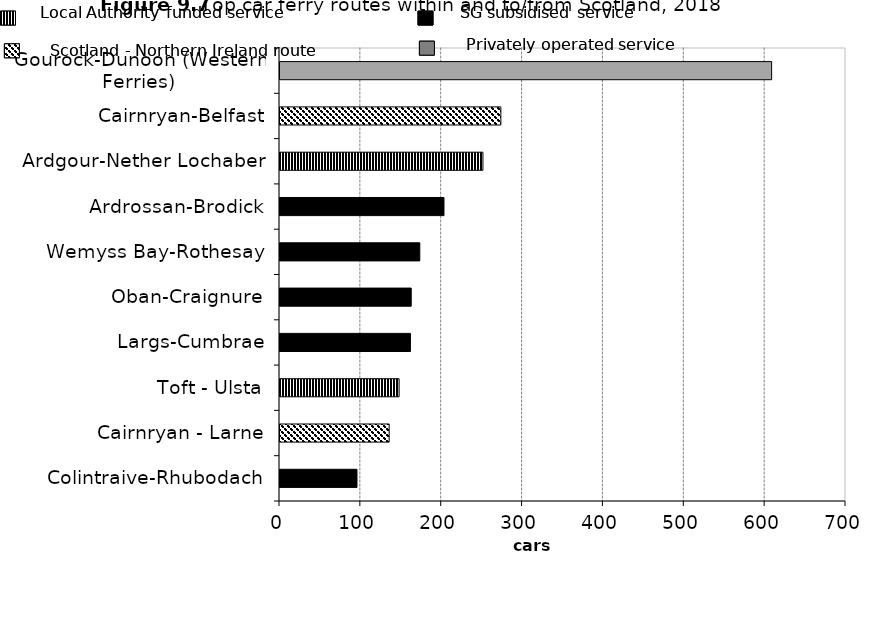
| Category | Cars |
|---|---|
| Colintraive-Rhubodach | 95.2 |
| Cairnryan - Larne | 135.01 |
| Toft - Ulsta | 147.28 |
| Largs-Cumbrae | 161.3 |
| Oban-Craignure | 162.3 |
| Wemyss Bay-Rothesay | 172.9 |
| Ardrossan-Brodick | 202.8 |
| Ardgour-Nether Lochaber | 251 |
| Cairnryan-Belfast | 273.142 |
| Gourock-Dunoon (Western Ferries) | 608 |